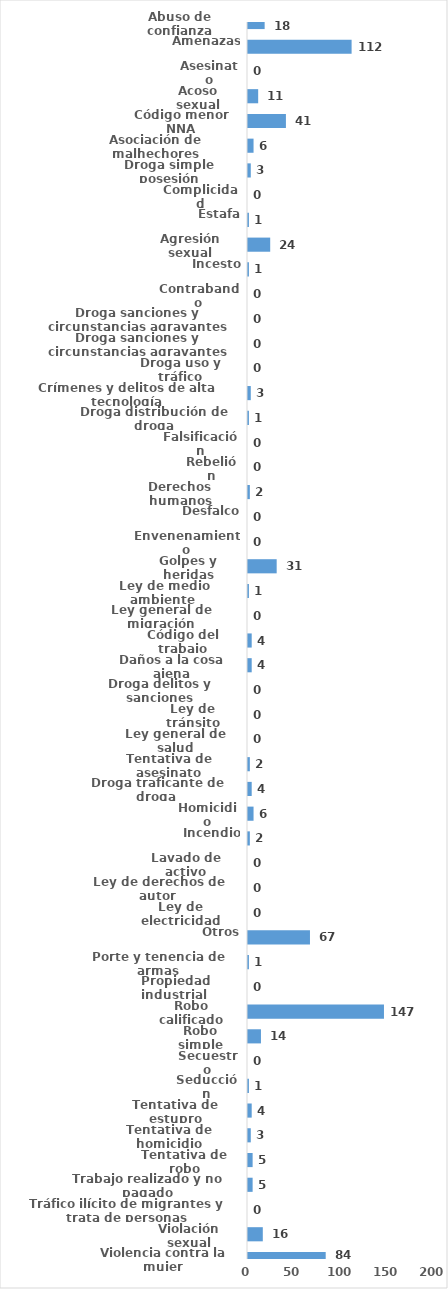
| Category | Series 0 |
|---|---|
| Abuso de confianza | 18 |
| Amenazas | 112 |
| Asesinato | 0 |
| Acoso sexual | 11 |
| Código menor NNA | 41 |
| Asociación de malhechores | 6 |
| Droga simple posesión | 3 |
| Complicidad | 0 |
| Estafa | 1 |
| Agresión sexual | 24 |
| Incesto | 1 |
| Contrabando | 0 |
| Droga sanciones y circunstancias agravantes | 0 |
| Droga sanciones y circunstancias agravantes | 0 |
| Droga uso y tráfico | 0 |
| Crímenes y delitos de alta tecnología | 3 |
| Droga distribución de droga | 1 |
| Falsificación | 0 |
| Rebelión | 0 |
| Derechos humanos | 2 |
| Desfalco | 0 |
| Envenenamiento | 0 |
| Golpes y heridas | 31 |
| Ley de medio ambiente  | 1 |
| Ley general de migración | 0 |
| Código del trabajo | 4 |
| Daños a la cosa ajena | 4 |
| Droga delitos y sanciones | 0 |
| Ley de tránsito | 0 |
| Ley general de salud | 0 |
| Tentativa de asesinato | 2 |
| Droga traficante de droga  | 4 |
| Homicidio | 6 |
| Incendio | 2 |
| Lavado de activo | 0 |
| Ley de derechos de autor  | 0 |
| Ley de electricidad | 0 |
| Otros | 67 |
| Porte y tenencia de armas | 1 |
| Propiedad industrial  | 0 |
| Robo calificado | 147 |
| Robo simple | 14 |
| Secuestro | 0 |
| Seducción | 1 |
| Tentativa de estupro | 4 |
| Tentativa de homicidio | 3 |
| Tentativa de robo | 5 |
| Trabajo realizado y no pagado | 5 |
| Tráfico ilícito de migrantes y trata de personas | 0 |
| Violación sexual | 16 |
| Violencia contra la mujer | 84 |